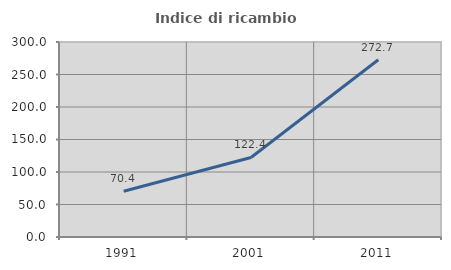
| Category | Indice di ricambio occupazionale  |
|---|---|
| 1991.0 | 70.412 |
| 2001.0 | 122.388 |
| 2011.0 | 272.664 |